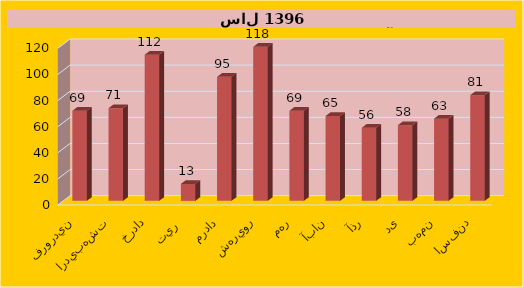
| Category | Series 0 |
|---|---|
| فروردين | 69 |
| ارديبهشت | 71 |
| خرداد | 112 |
| تير  | 13 |
| مرداد | 95 |
| شهريور | 118 |
| مهر | 69 |
| آبان | 65 |
| آذر | 56 |
| دی | 58 |
| بهمن | 63 |
| اسفند | 81 |